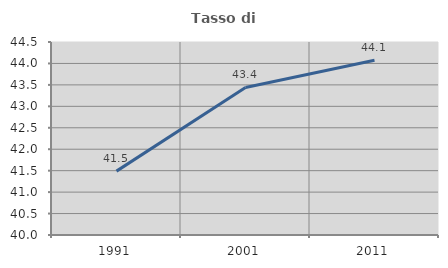
| Category | Tasso di occupazione   |
|---|---|
| 1991.0 | 41.489 |
| 2001.0 | 43.44 |
| 2011.0 | 44.073 |